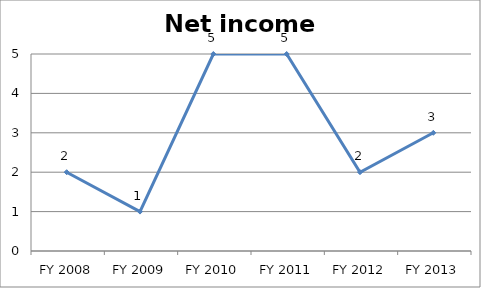
| Category | Net income score |
|---|---|
| FY 2013 | 3 |
| FY 2012 | 2 |
| FY 2011 | 5 |
| FY 2010 | 5 |
| FY 2009 | 1 |
| FY 2008 | 2 |